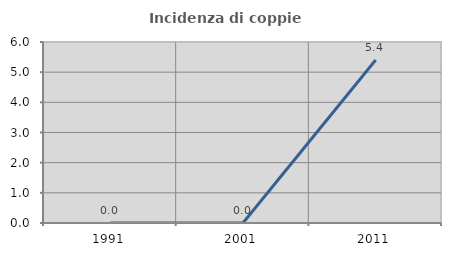
| Category | Incidenza di coppie miste |
|---|---|
| 1991.0 | 0 |
| 2001.0 | 0 |
| 2011.0 | 5.405 |